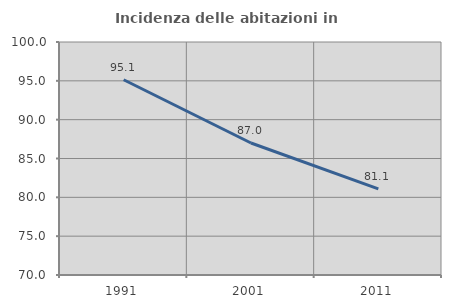
| Category | Incidenza delle abitazioni in proprietà  |
|---|---|
| 1991.0 | 95.139 |
| 2001.0 | 86.992 |
| 2011.0 | 81.081 |